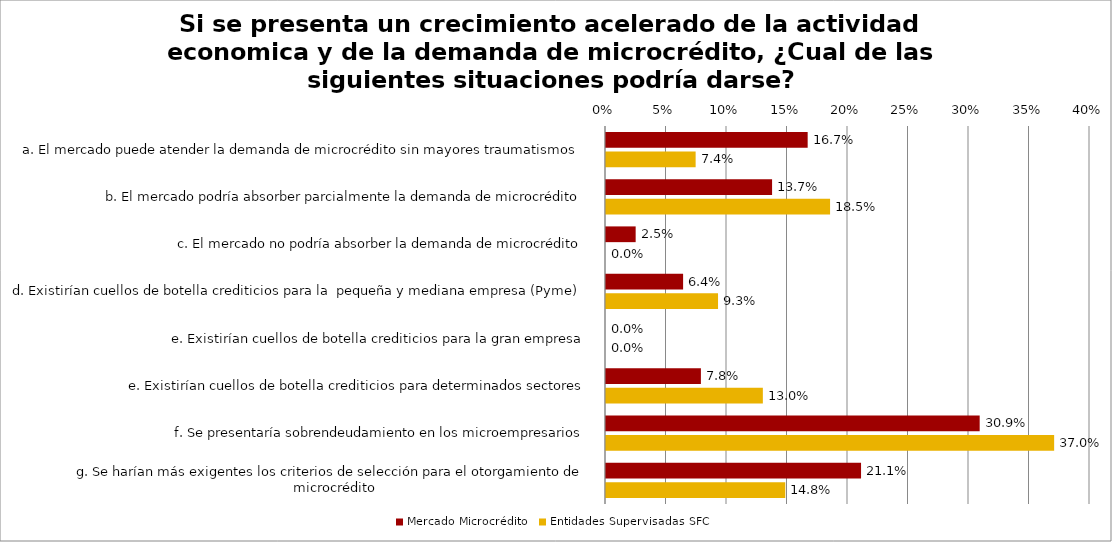
| Category | Mercado Microcrédito | Entidades Supervisadas SFC |
|---|---|---|
| a. El mercado puede atender la demanda de microcrédito sin mayores traumatismos | 0.167 | 0.074 |
| b. El mercado podría absorber parcialmente la demanda de microcrédito | 0.137 | 0.185 |
| c. El mercado no podría absorber la demanda de microcrédito | 0.025 | 0 |
| d. Existirían cuellos de botella crediticios para la  pequeña y mediana empresa (Pyme) | 0.064 | 0.093 |
| e. Existirían cuellos de botella crediticios para la gran empresa | 0 | 0 |
| e. Existirían cuellos de botella crediticios para determinados sectores | 0.078 | 0.13 |
| f. Se presentaría sobrendeudamiento en los microempresarios | 0.309 | 0.37 |
| g. Se harían más exigentes los criterios de selección para el otorgamiento de microcrédito | 0.211 | 0.148 |